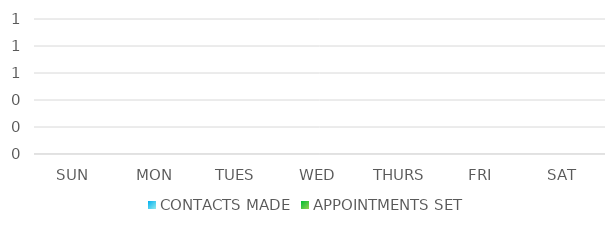
| Category | CONTACTS MADE | APPOINTMENTS SET |
|---|---|---|
| SUN | 0 | 0 |
| MON | 0 | 0 |
| TUES | 0 | 0 |
| WED | 0 | 0 |
| THURS | 0 | 0 |
| FRI | 0 | 0 |
| SAT | 0 | 0 |